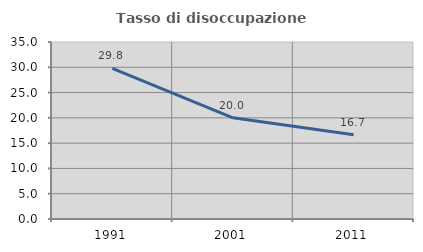
| Category | Tasso di disoccupazione giovanile  |
|---|---|
| 1991.0 | 29.787 |
| 2001.0 | 20 |
| 2011.0 | 16.667 |